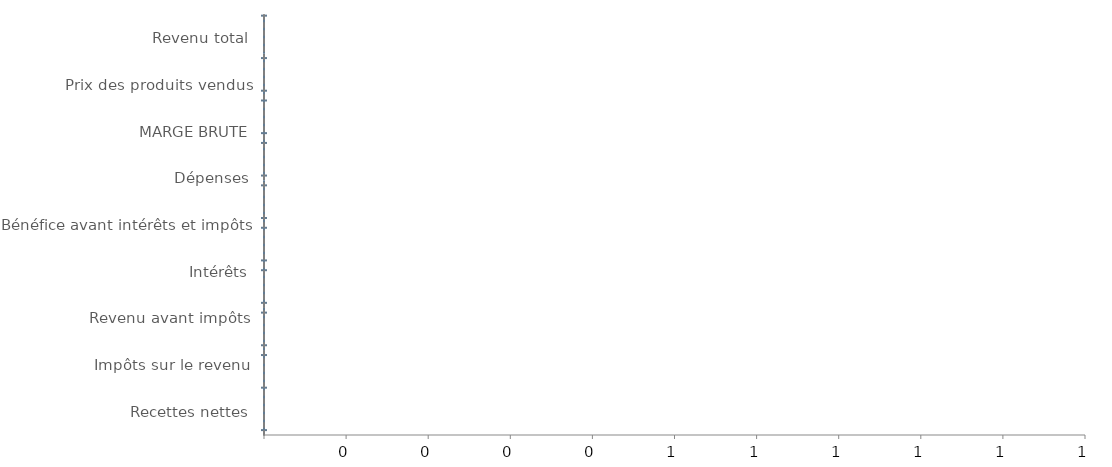
| Category | Fins | Vide | Perte neg | Gain neg | Perte pos | Gain pos |
|---|---|---|---|---|---|---|
| Revenu total | 0 | 0 | 0 | 0 | 0 | 0 |
| Prix des produits vendus | 0 | 0 | 0 | 0 | 0 | 0 |
| MARGE BRUTE | 0 | 0 | 0 | 0 | 0 | 0 |
| Dépenses | 0 | 0 | 0 | 0 | 0 | 0 |
| Bénéfice avant intérêts et impôts | 0 | 0 | 0 | 0 | 0 | 0 |
| Intérêts | 0 | 0 | 0 | 0 | 0 | 0 |
| Revenu avant impôts | 0 | 0 | 0 | 0 | 0 | 0 |
| Impôts sur le revenu | 0 | 0 | 0 | 0 | 0 | 0 |
| Recettes nettes | 0 | 0 | 0 | 0 | 0 | 0 |